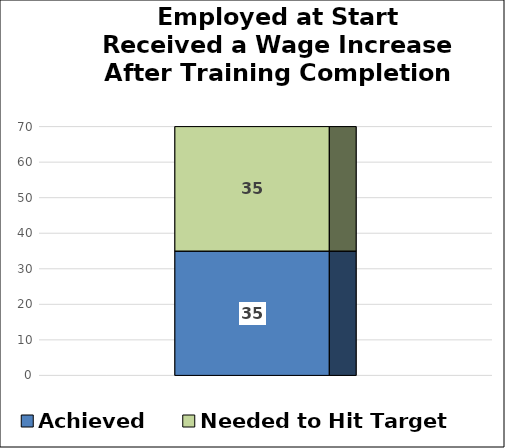
| Category | Achieved | Needed to Hit Target |
|---|---|---|
| Number of Participants Employed at Enrollment Received a Wage Increase After Training Completion | 35 | 35 |